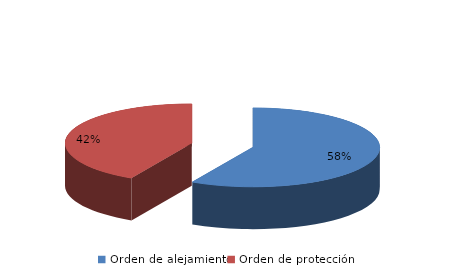
| Category | Series 0 |
|---|---|
| Orden de alejamiento | 587 |
| Orden de protección | 427 |